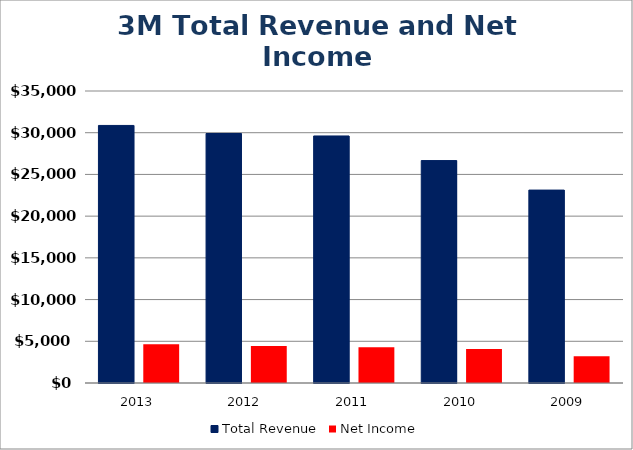
| Category | Total Revenue | Net Income |
|---|---|---|
| 2013.0 | 30871 | 4659 |
| 2012.0 | 29904 | 4444 |
| 2011.0 | 29611 | 4283 |
| 2010.0 | 26662 | 4085 |
| 2009.0 | 23123 | 3193 |